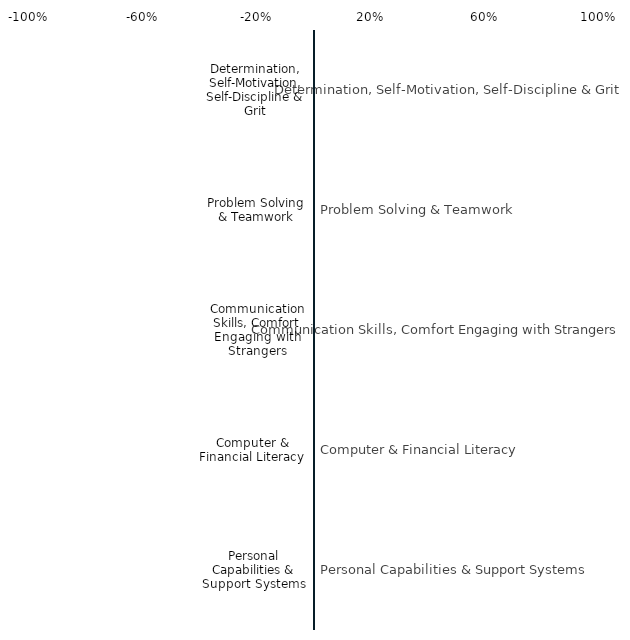
| Category | Series 0 |
|---|---|
| Determination, Self-Motivation, Self-Discipline & Grit | 0 |
| Problem Solving & Teamwork | 0 |
| Communication Skills, Comfort Engaging with Strangers | 0 |
| Computer & Financial Literacy | 0 |
| Personal Capabilities & Support Systems | 0 |